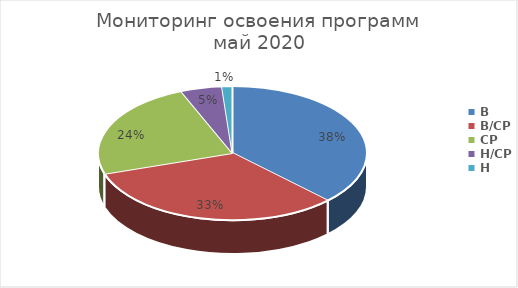
| Category | Series 0 |
|---|---|
| В | 30 |
| В/СР | 26 |
| СР | 19 |
| Н/СР | 4 |
| Н | 1 |